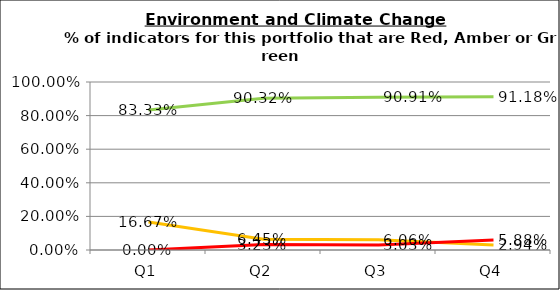
| Category | Green | Amber | Red |
|---|---|---|---|
| Q1 | 0.833 | 0.167 | 0 |
| Q2 | 0.903 | 0.065 | 0.032 |
| Q3 | 0.909 | 0.061 | 0.03 |
| Q4 | 0.912 | 0.029 | 0.059 |